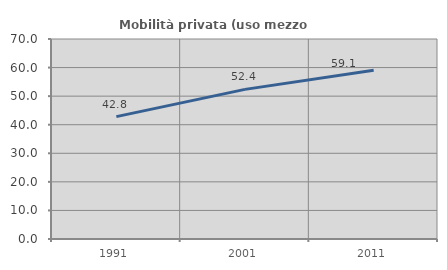
| Category | Mobilità privata (uso mezzo privato) |
|---|---|
| 1991.0 | 42.829 |
| 2001.0 | 52.366 |
| 2011.0 | 59.052 |